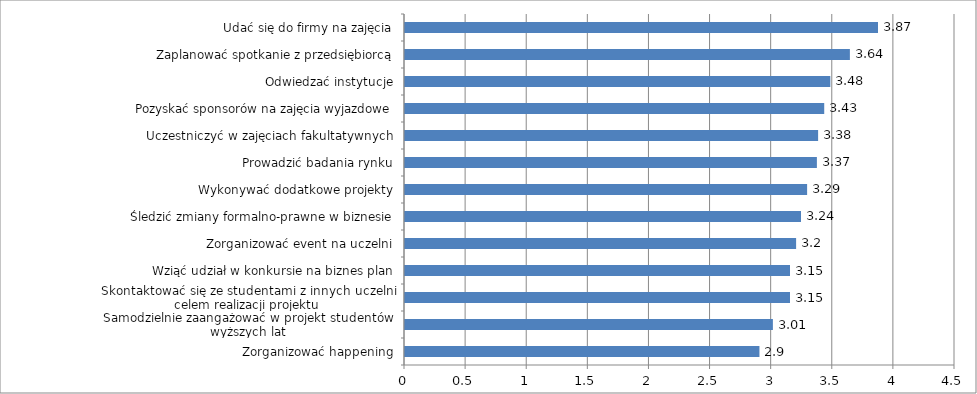
| Category | wartość |
|---|---|
| Zorganizować happening | 2.9 |
| Samodzielnie zaangażować w projekt studentów wyższych lat | 3.01 |
| Skontaktować się ze studentami z innych uczelni celem realizacji projektu | 3.15 |
| Wziąć udział w konkursie na biznes plan | 3.15 |
| Zorganizować event na uczelni | 3.2 |
| Śledzić zmiany formalno-prawne w biznesie | 3.24 |
| Wykonywać dodatkowe projekty | 3.29 |
| Prowadzić badania rynku | 3.37 |
| Uczestniczyć w zajęciach fakultatywnych | 3.38 |
| Pozyskać sponsorów na zajęcia wyjazdowe | 3.43 |
| Odwiedzać instytucje | 3.48 |
| Zaplanować spotkanie z przedsiębiorcą | 3.64 |
| Udać się do firmy na zajęcia | 3.87 |